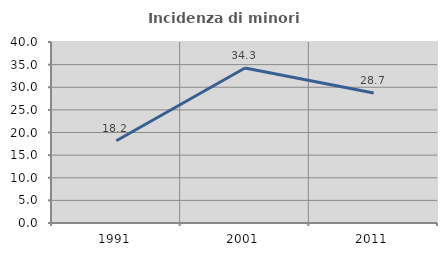
| Category | Incidenza di minori stranieri |
|---|---|
| 1991.0 | 18.182 |
| 2001.0 | 34.266 |
| 2011.0 | 28.721 |